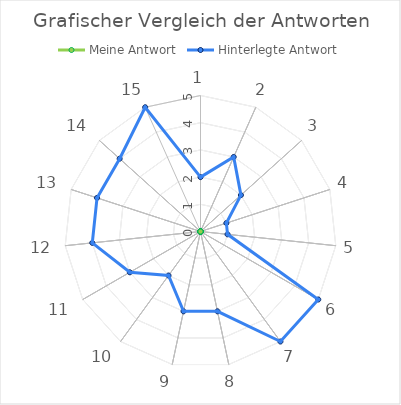
| Category | Hilfslinien 1 | Hilfslinien 2 | Meine Antwort | Hinterlegte Antwort |
|---|---|---|---|---|
| 0 | 0 | 5 | 0 | 2 |
| 1 | 5 | 0 | 0 | 3 |
| 2 | 0 | 5 | 0 | 2 |
| 3 | 5 | 0 | 0 | 1 |
| 4 | 0 | 5 | 0 | 1 |
| 5 | 5 | 0 | 0 | 5 |
| 6 | 0 | 5 | 0 | 5 |
| 7 | 5 | 0 | 0 | 3 |
| 8 | 0 | 5 | 0 | 3 |
| 9 | 5 | 0 | 0 | 2 |
| 10 | 0 | 5 | 0 | 3 |
| 11 | 5 | 0 | 0 | 4 |
| 12 | 0 | 5 | 0 | 4 |
| 13 | 5 | 0 | 0 | 4 |
| 14 | 0 | 5 | 0 | 5 |